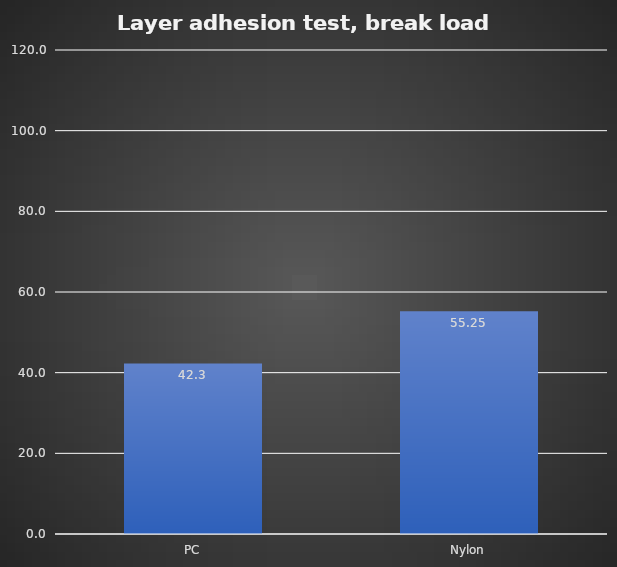
| Category | Average |
|---|---|
| PC | 42.3 |
| Nylon | 55.25 |